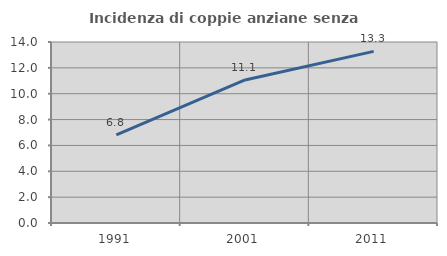
| Category | Incidenza di coppie anziane senza figli  |
|---|---|
| 1991.0 | 6.818 |
| 2001.0 | 11.066 |
| 2011.0 | 13.274 |